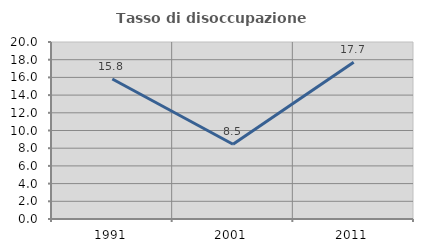
| Category | Tasso di disoccupazione giovanile  |
|---|---|
| 1991.0 | 15.822 |
| 2001.0 | 8.451 |
| 2011.0 | 17.717 |